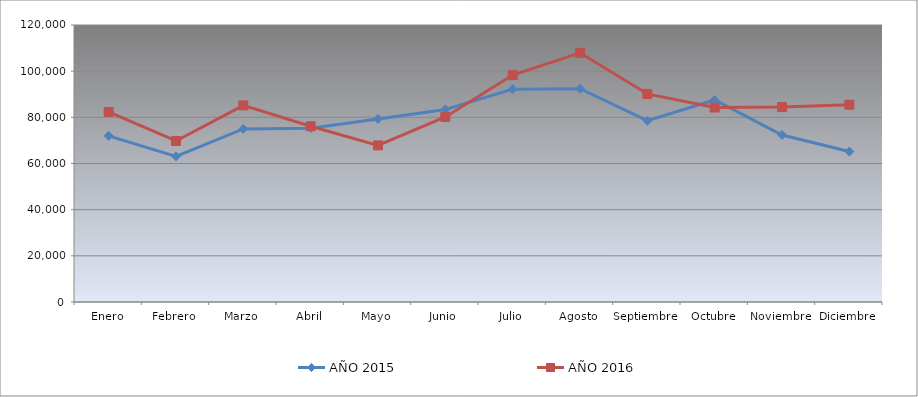
| Category | AÑO 2015 | AÑO 2016 |
|---|---|---|
| Enero | 71975.377 | 82341.813 |
| Febrero | 63091.715 | 69764.185 |
| Marzo | 74997.177 | 85167.423 |
| Abril | 75311.759 | 76139.975 |
| Mayo | 79312.756 | 67841.289 |
| Junio | 83419.622 | 80185.551 |
| Julio | 92196.892 | 98308.289 |
| Agosto | 92397.647 | 107949.909 |
| Septiembre | 78533.597 | 90127.584 |
| Octubre | 87516.186 | 84240.427 |
| Noviembre | 72346.964 | 84453.993 |
| Diciembre | 65164.889 | 85475.4 |